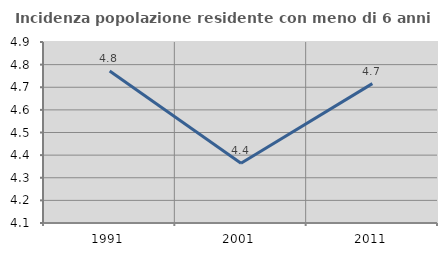
| Category | Incidenza popolazione residente con meno di 6 anni |
|---|---|
| 1991.0 | 4.772 |
| 2001.0 | 4.364 |
| 2011.0 | 4.716 |